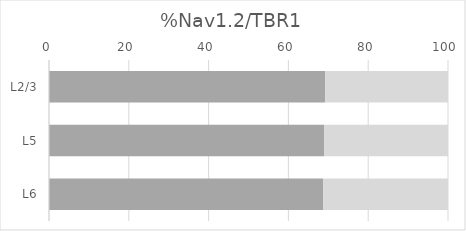
| Category | Series 0 | Series 1 |
|---|---|---|
| L2/3 | 69.246 | 30.754 |
| L5 | 68.945 | 31.055 |
| L6 | 68.679 | 31.321 |